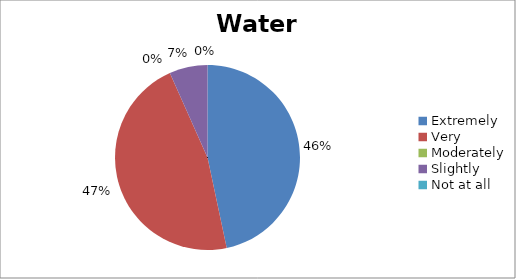
| Category | Water |
|---|---|
| Extremely | 7 |
| Very | 7 |
| Moderately | 0 |
| Slightly | 1 |
| Not at all | 0 |